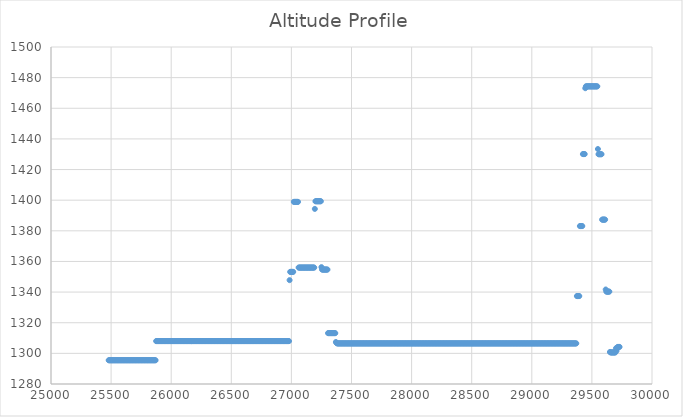
| Category | Series 0 |
|---|---|
| 25480.0 | 1295.5 |
| 25485.0 | 1295.5 |
| 25490.0 | 1295.5 |
| 25495.0 | 1295.5 |
| 25500.0 | 1295.5 |
| 25505.0 | 1295.5 |
| 25510.0 | 1295.5 |
| 25515.0 | 1295.5 |
| 25520.0 | 1295.5 |
| 25525.0 | 1295.5 |
| 25530.0 | 1295.5 |
| 25535.0 | 1295.5 |
| 25540.0 | 1295.5 |
| 25545.0 | 1295.5 |
| 25550.0 | 1295.5 |
| 25555.0 | 1295.5 |
| 25560.0 | 1295.5 |
| 25565.0 | 1295.5 |
| 25570.0 | 1295.5 |
| 25575.0 | 1295.5 |
| 25580.0 | 1295.5 |
| 25585.0 | 1295.5 |
| 25590.0 | 1295.5 |
| 25595.0 | 1295.5 |
| 25600.0 | 1295.5 |
| 25605.0 | 1295.5 |
| 25610.0 | 1295.5 |
| 25615.0 | 1295.5 |
| 25620.0 | 1295.5 |
| 25625.0 | 1295.5 |
| 25630.0 | 1295.5 |
| 25635.0 | 1295.5 |
| 25640.0 | 1295.5 |
| 25645.0 | 1295.5 |
| 25650.0 | 1295.5 |
| 25655.0 | 1295.5 |
| 25660.0 | 1295.5 |
| 25665.0 | 1295.5 |
| 25670.0 | 1295.5 |
| 25675.0 | 1295.5 |
| 25680.0 | 1295.5 |
| 25685.0 | 1295.5 |
| 25690.0 | 1295.5 |
| 25695.0 | 1295.5 |
| 25700.0 | 1295.5 |
| 25705.0 | 1295.5 |
| 25710.0 | 1295.5 |
| 25715.0 | 1295.5 |
| 25720.0 | 1295.5 |
| 25725.0 | 1295.5 |
| 25730.0 | 1295.5 |
| 25735.0 | 1295.5 |
| 25740.0 | 1295.5 |
| 25745.0 | 1295.5 |
| 25750.0 | 1295.5 |
| 25755.0 | 1295.5 |
| 25760.0 | 1295.5 |
| 25765.0 | 1295.5 |
| 25770.0 | 1295.5 |
| 25775.0 | 1295.5 |
| 25780.0 | 1295.5 |
| 25785.0 | 1295.5 |
| 25790.0 | 1295.5 |
| 25795.0 | 1295.5 |
| 25800.0 | 1295.5 |
| 25805.0 | 1295.5 |
| 25810.0 | 1295.5 |
| 25815.0 | 1295.5 |
| 25820.0 | 1295.5 |
| 25825.0 | 1295.5 |
| 25830.0 | 1295.5 |
| 25835.0 | 1295.5 |
| 25840.0 | 1295.5 |
| 25845.0 | 1295.5 |
| 25850.0 | 1295.5 |
| 25855.0 | 1295.5 |
| 25860.0 | 1295.5 |
| 25865.0 | 1295.5 |
| 25870.0 | 1295.5 |
| 25875.0 | 1308 |
| 25880.0 | 1308 |
| 25885.0 | 1308 |
| 25890.0 | 1308 |
| 25895.0 | 1308 |
| 25900.0 | 1308 |
| 25905.0 | 1308 |
| 25910.0 | 1308 |
| 25915.0 | 1308 |
| 25920.0 | 1308 |
| 25925.0 | 1308 |
| 25930.0 | 1308 |
| 25935.0 | 1308 |
| 25940.0 | 1308 |
| 25945.0 | 1308 |
| 25950.0 | 1308 |
| 25955.0 | 1308 |
| 25960.0 | 1308 |
| 25965.0 | 1308 |
| 25970.0 | 1308 |
| 25975.0 | 1308 |
| 25980.0 | 1308 |
| 25985.0 | 1308 |
| 25990.0 | 1308 |
| 25995.0 | 1308 |
| 26000.0 | 1308 |
| 26005.0 | 1308 |
| 26010.0 | 1308 |
| 26015.0 | 1308 |
| 26020.0 | 1308 |
| 26025.0 | 1308 |
| 26030.0 | 1308 |
| 26035.0 | 1308 |
| 26040.0 | 1308 |
| 26045.0 | 1308 |
| 26050.0 | 1308 |
| 26055.0 | 1308 |
| 26060.0 | 1308 |
| 26065.0 | 1308 |
| 26070.0 | 1308 |
| 26075.0 | 1308 |
| 26080.0 | 1308 |
| 26085.0 | 1308 |
| 26090.0 | 1308 |
| 26095.0 | 1308 |
| 26100.0 | 1308 |
| 26105.0 | 1308 |
| 26110.0 | 1308 |
| 26115.0 | 1308 |
| 26120.0 | 1308 |
| 26125.0 | 1308 |
| 26130.0 | 1308 |
| 26135.0 | 1308 |
| 26140.0 | 1308 |
| 26145.0 | 1308 |
| 26150.0 | 1308 |
| 26155.0 | 1308 |
| 26160.0 | 1308 |
| 26165.0 | 1308 |
| 26170.0 | 1308 |
| 26170.0 | 1308 |
| 26175.0 | 1308 |
| 26180.0 | 1308 |
| 26185.0 | 1308 |
| 26190.0 | 1308 |
| 26195.0 | 1308 |
| 26200.0 | 1308 |
| 26205.0 | 1308 |
| 26210.0 | 1308 |
| 26215.0 | 1308 |
| 26220.0 | 1308 |
| 26225.0 | 1308 |
| 26230.0 | 1308 |
| 26235.0 | 1308 |
| 26240.0 | 1308 |
| 26245.0 | 1308 |
| 26250.0 | 1308 |
| 26255.0 | 1308 |
| 26260.0 | 1308 |
| 26265.0 | 1308 |
| 26270.0 | 1308 |
| 26275.0 | 1308 |
| 26280.0 | 1308 |
| 26285.0 | 1308 |
| 26290.0 | 1308 |
| 26295.0 | 1308 |
| 26300.0 | 1308 |
| 26305.0 | 1308 |
| 26310.0 | 1308 |
| 26315.0 | 1308 |
| 26320.0 | 1308 |
| 26325.0 | 1308 |
| 26330.0 | 1308 |
| 26335.0 | 1308 |
| 26340.0 | 1308 |
| 26345.0 | 1308 |
| 26350.0 | 1308 |
| 26355.0 | 1308 |
| 26360.0 | 1308 |
| 26365.0 | 1308 |
| 26370.0 | 1308 |
| 26375.0 | 1308 |
| 26380.0 | 1308 |
| 26385.0 | 1308 |
| 26390.0 | 1308 |
| 26395.0 | 1308 |
| 26400.0 | 1308 |
| 26405.0 | 1308 |
| 26410.0 | 1308 |
| 26415.0 | 1308 |
| 26420.0 | 1308 |
| 26425.0 | 1308 |
| 26430.0 | 1308 |
| 26435.0 | 1308 |
| 26440.0 | 1308 |
| 26445.0 | 1308 |
| 26450.0 | 1308 |
| 26455.0 | 1308 |
| 26460.0 | 1308 |
| 26465.0 | 1308 |
| 26470.0 | 1308 |
| 26475.0 | 1308 |
| 26480.0 | 1308 |
| 26485.0 | 1308 |
| 26490.0 | 1308 |
| 26495.0 | 1308 |
| 26500.0 | 1308 |
| 26505.0 | 1308 |
| 26510.0 | 1308 |
| 26515.0 | 1308 |
| 26520.0 | 1308 |
| 26525.0 | 1308 |
| 26530.0 | 1308 |
| 26535.0 | 1308 |
| 26540.0 | 1308 |
| 26545.0 | 1308 |
| 26550.0 | 1308 |
| 26555.0 | 1308 |
| 26560.0 | 1308 |
| 26565.0 | 1308 |
| 26570.0 | 1308 |
| 26575.0 | 1308 |
| 26580.0 | 1308 |
| 26585.0 | 1308 |
| 26590.0 | 1308 |
| 26595.0 | 1308 |
| 26600.0 | 1308 |
| 26605.0 | 1308 |
| 26610.0 | 1308 |
| 26615.0 | 1308 |
| 26620.0 | 1308 |
| 26625.0 | 1308 |
| 26630.0 | 1308 |
| 26635.0 | 1308 |
| 26640.0 | 1308 |
| 26645.0 | 1308 |
| 26650.0 | 1308 |
| 26655.0 | 1308 |
| 26660.0 | 1308 |
| 26665.0 | 1308 |
| 26670.0 | 1308 |
| 26675.0 | 1308 |
| 26680.0 | 1308 |
| 26685.0 | 1308 |
| 26690.0 | 1308 |
| 26695.0 | 1308 |
| 26700.0 | 1308 |
| 26705.0 | 1308 |
| 26710.0 | 1308 |
| 26715.0 | 1308 |
| 26720.0 | 1308 |
| 26725.0 | 1308 |
| 26730.0 | 1308 |
| 26735.0 | 1308 |
| 26740.0 | 1308 |
| 26745.0 | 1308 |
| 26750.0 | 1308 |
| 26755.0 | 1308 |
| 26760.0 | 1308 |
| 26765.0 | 1308 |
| 26770.0 | 1308 |
| 26775.0 | 1308 |
| 26780.0 | 1308 |
| 26785.0 | 1308 |
| 26790.0 | 1308 |
| 26795.0 | 1308 |
| 26800.0 | 1308 |
| 26805.0 | 1308 |
| 26810.0 | 1308 |
| 26815.0 | 1308 |
| 26820.0 | 1308 |
| 26825.0 | 1308 |
| 26830.0 | 1308 |
| 26835.0 | 1308 |
| 26840.0 | 1308 |
| 26845.0 | 1308 |
| 26850.0 | 1308 |
| 26855.0 | 1308 |
| 26860.0 | 1308 |
| 26865.0 | 1308 |
| 26870.0 | 1308 |
| 26875.0 | 1308 |
| 26880.0 | 1308 |
| 26885.0 | 1308 |
| 26890.0 | 1308 |
| 26895.0 | 1308 |
| 26900.0 | 1308 |
| 26905.0 | 1308 |
| 26910.0 | 1308 |
| 26915.0 | 1308 |
| 26920.0 | 1308 |
| 26925.0 | 1308 |
| 26930.0 | 1308 |
| 26935.0 | 1308 |
| 26940.0 | 1308 |
| 26945.0 | 1308 |
| 26950.0 | 1308 |
| 26955.0 | 1308 |
| 26960.0 | 1308 |
| 26965.0 | 1308 |
| 26970.0 | 1308 |
| 26975.0 | 1308 |
| 26980.0 | 1308 |
| 26985.0 | 1347.8 |
| 26990.0 | 1353.2 |
| 26995.0 | 1353.2 |
| 27000.0 | 1353.2 |
| 27005.0 | 1353.2 |
| 27010.0 | 1353.2 |
| 27015.0 | 1353.2 |
| 27020.0 | 1398.9 |
| 27025.0 | 1398.9 |
| 27030.0 | 1398.9 |
| 27035.0 | 1398.9 |
| 27040.0 | 1398.9 |
| 27045.0 | 1398.9 |
| 27050.0 | 1398.9 |
| 27055.0 | 1398.9 |
| 27060.0 | 1356 |
| 27065.0 | 1356 |
| 27070.0 | 1356 |
| 27075.0 | 1356 |
| 27080.0 | 1356 |
| 27085.0 | 1356 |
| 27090.0 | 1356 |
| 27095.0 | 1356 |
| 27100.0 | 1356 |
| 27105.0 | 1356 |
| 27110.0 | 1356 |
| 27115.0 | 1356 |
| 27120.0 | 1356 |
| 27125.0 | 1356 |
| 27130.0 | 1356 |
| 27135.0 | 1356 |
| 27140.0 | 1356 |
| 27145.0 | 1356 |
| 27150.0 | 1356 |
| 27155.0 | 1356 |
| 27160.0 | 1356 |
| 27165.0 | 1356 |
| 27170.0 | 1356 |
| 27175.0 | 1356 |
| 27180.0 | 1356 |
| 27185.0 | 1356 |
| 27190.0 | 1356 |
| 27195.0 | 1394.3 |
| 27200.0 | 1399.3 |
| 27205.0 | 1399.3 |
| 27210.0 | 1399.3 |
| 27215.0 | 1399.3 |
| 27220.0 | 1399.3 |
| 27225.0 | 1399.3 |
| 27230.0 | 1399.3 |
| 27235.0 | 1399.3 |
| 27240.0 | 1399.3 |
| 27245.0 | 1399.3 |
| 27250.0 | 1356.3 |
| 27255.0 | 1354.7 |
| 27260.0 | 1354.7 |
| 27265.0 | 1354.7 |
| 27270.0 | 1354.7 |
| 27275.0 | 1354.7 |
| 27280.0 | 1354.7 |
| 27285.0 | 1354.7 |
| 27290.0 | 1354.7 |
| 27295.0 | 1354.7 |
| 27300.0 | 1354.7 |
| 27305.0 | 1313.2 |
| 27310.0 | 1313.2 |
| 27315.0 | 1313.2 |
| 27320.0 | 1313.2 |
| 27325.0 | 1313.2 |
| 27330.0 | 1313.2 |
| 27335.0 | 1313.2 |
| 27340.0 | 1313.2 |
| 27345.0 | 1313.2 |
| 27350.0 | 1313.2 |
| 27355.0 | 1313.2 |
| 27360.0 | 1313.2 |
| 27365.0 | 1313.2 |
| 27370.0 | 1307.4 |
| 27375.0 | 1306.9 |
| 27380.0 | 1306.5 |
| 27385.0 | 1306.5 |
| 27390.0 | 1306.5 |
| 27395.0 | 1306.5 |
| 27400.0 | 1306.5 |
| 27405.0 | 1306.5 |
| 27410.0 | 1306.5 |
| 27415.0 | 1306.5 |
| 27420.0 | 1306.5 |
| 27425.0 | 1306.5 |
| 27430.0 | 1306.5 |
| 27435.0 | 1306.5 |
| 27440.0 | 1306.5 |
| 27445.0 | 1306.5 |
| 27450.0 | 1306.5 |
| 27455.0 | 1306.5 |
| 27460.0 | 1306.5 |
| 27465.0 | 1306.5 |
| 27470.0 | 1306.5 |
| 27475.0 | 1306.5 |
| 27480.0 | 1306.5 |
| 27485.0 | 1306.5 |
| 27490.0 | 1306.5 |
| 27495.0 | 1306.5 |
| 27500.0 | 1306.5 |
| 27505.0 | 1306.5 |
| 27510.0 | 1306.5 |
| 27515.0 | 1306.5 |
| 27520.0 | 1306.5 |
| 27525.0 | 1306.5 |
| 27530.0 | 1306.5 |
| 27535.0 | 1306.5 |
| 27540.0 | 1306.5 |
| 27545.0 | 1306.5 |
| 27550.0 | 1306.5 |
| 27555.0 | 1306.5 |
| 27560.0 | 1306.5 |
| 27565.0 | 1306.5 |
| 27570.0 | 1306.5 |
| 27575.0 | 1306.5 |
| 27580.0 | 1306.5 |
| 27585.0 | 1306.5 |
| 27590.0 | 1306.5 |
| 27595.0 | 1306.5 |
| 27600.0 | 1306.5 |
| 27605.0 | 1306.5 |
| 27610.0 | 1306.5 |
| 27615.0 | 1306.5 |
| 27620.0 | 1306.5 |
| 27625.0 | 1306.5 |
| 27630.0 | 1306.5 |
| 27635.0 | 1306.5 |
| 27640.0 | 1306.5 |
| 27645.0 | 1306.5 |
| 27650.0 | 1306.5 |
| 27655.0 | 1306.5 |
| 27660.0 | 1306.5 |
| 27665.0 | 1306.5 |
| 27670.0 | 1306.5 |
| 27675.0 | 1306.5 |
| 27680.0 | 1306.5 |
| 27685.0 | 1306.5 |
| 27690.0 | 1306.5 |
| 27695.0 | 1306.5 |
| 27700.0 | 1306.5 |
| 27705.0 | 1306.5 |
| 27710.0 | 1306.5 |
| 27715.0 | 1306.5 |
| 27720.0 | 1306.5 |
| 27725.0 | 1306.5 |
| 27730.0 | 1306.5 |
| 27735.0 | 1306.5 |
| 27740.0 | 1306.5 |
| 27745.0 | 1306.5 |
| 27750.0 | 1306.5 |
| 27755.0 | 1306.5 |
| 27760.0 | 1306.5 |
| 27765.0 | 1306.5 |
| 27770.0 | 1306.5 |
| 27775.0 | 1306.5 |
| 27780.0 | 1306.5 |
| 27785.0 | 1306.5 |
| 27790.0 | 1306.5 |
| 27795.0 | 1306.5 |
| 27800.0 | 1306.5 |
| 27805.0 | 1306.5 |
| 27810.0 | 1306.5 |
| 27815.0 | 1306.5 |
| 27820.0 | 1306.5 |
| 27825.0 | 1306.5 |
| 27830.0 | 1306.5 |
| 27835.0 | 1306.5 |
| 27840.0 | 1306.5 |
| 27845.0 | 1306.5 |
| 27850.0 | 1306.5 |
| 27855.0 | 1306.5 |
| 27860.0 | 1306.5 |
| 27865.0 | 1306.5 |
| 27870.0 | 1306.5 |
| 27875.0 | 1306.5 |
| 27880.0 | 1306.5 |
| 27885.0 | 1306.5 |
| 27890.0 | 1306.5 |
| 27895.0 | 1306.5 |
| 27900.0 | 1306.5 |
| 27905.0 | 1306.5 |
| 27910.0 | 1306.5 |
| 27915.0 | 1306.5 |
| 27920.0 | 1306.5 |
| 27925.0 | 1306.5 |
| 27930.0 | 1306.5 |
| 27935.0 | 1306.5 |
| 27940.0 | 1306.5 |
| 27945.0 | 1306.5 |
| 27950.0 | 1306.5 |
| 27955.0 | 1306.5 |
| 27960.0 | 1306.5 |
| 27965.0 | 1306.5 |
| 27970.0 | 1306.5 |
| 27975.0 | 1306.5 |
| 27980.0 | 1306.5 |
| 27985.0 | 1306.5 |
| 27990.0 | 1306.5 |
| 27995.0 | 1306.5 |
| 28000.0 | 1306.5 |
| 28005.0 | 1306.5 |
| 28010.0 | 1306.5 |
| 28015.0 | 1306.5 |
| 28020.0 | 1306.5 |
| 28025.0 | 1306.5 |
| 28030.0 | 1306.5 |
| 28035.0 | 1306.5 |
| 28040.0 | 1306.5 |
| 28045.0 | 1306.5 |
| 28050.0 | 1306.5 |
| 28055.0 | 1306.5 |
| 28060.0 | 1306.5 |
| 28065.0 | 1306.5 |
| 28070.0 | 1306.5 |
| 28075.0 | 1306.5 |
| 28080.0 | 1306.5 |
| 28085.0 | 1306.5 |
| 28090.0 | 1306.5 |
| 28095.0 | 1306.5 |
| 28100.0 | 1306.5 |
| 28105.0 | 1306.5 |
| 28110.0 | 1306.5 |
| 28115.0 | 1306.5 |
| 28120.0 | 1306.5 |
| 28125.0 | 1306.5 |
| 28130.0 | 1306.5 |
| 28135.0 | 1306.5 |
| 28140.0 | 1306.5 |
| 28145.0 | 1306.5 |
| 28150.0 | 1306.5 |
| 28155.0 | 1306.5 |
| 28160.0 | 1306.5 |
| 28165.0 | 1306.5 |
| 28170.0 | 1306.5 |
| 28175.0 | 1306.5 |
| 28180.0 | 1306.5 |
| 28185.0 | 1306.5 |
| 28190.0 | 1306.5 |
| 28195.0 | 1306.5 |
| 28200.0 | 1306.5 |
| 28205.0 | 1306.5 |
| 28210.0 | 1306.5 |
| 28215.0 | 1306.5 |
| 28220.0 | 1306.5 |
| 28225.0 | 1306.5 |
| 28230.0 | 1306.5 |
| 28235.0 | 1306.5 |
| 28240.0 | 1306.5 |
| 28245.0 | 1306.5 |
| 28250.0 | 1306.5 |
| 28255.0 | 1306.5 |
| 28260.0 | 1306.5 |
| 28265.0 | 1306.5 |
| 28270.0 | 1306.5 |
| 28275.0 | 1306.5 |
| 28280.0 | 1306.5 |
| 28285.0 | 1306.5 |
| 28290.0 | 1306.5 |
| 28295.0 | 1306.5 |
| 28300.0 | 1306.5 |
| 28305.0 | 1306.5 |
| 28310.0 | 1306.5 |
| 28315.0 | 1306.5 |
| 28320.0 | 1306.5 |
| 28325.0 | 1306.5 |
| 28330.0 | 1306.5 |
| 28335.0 | 1306.5 |
| 28340.0 | 1306.5 |
| 28345.0 | 1306.5 |
| 28350.0 | 1306.5 |
| 28355.0 | 1306.5 |
| 28360.0 | 1306.5 |
| 28365.0 | 1306.5 |
| 28370.0 | 1306.5 |
| 28375.0 | 1306.5 |
| 28380.0 | 1306.5 |
| 28385.0 | 1306.5 |
| 28390.0 | 1306.5 |
| 28395.0 | 1306.5 |
| 28400.0 | 1306.5 |
| 28405.0 | 1306.5 |
| 28410.0 | 1306.5 |
| 28415.0 | 1306.5 |
| 28420.0 | 1306.5 |
| 28425.0 | 1306.5 |
| 28430.0 | 1306.5 |
| 28435.0 | 1306.5 |
| 28440.0 | 1306.5 |
| 28445.0 | 1306.5 |
| 28450.0 | 1306.5 |
| 28455.0 | 1306.5 |
| 28460.0 | 1306.5 |
| 28465.0 | 1306.5 |
| 28470.0 | 1306.5 |
| 28475.0 | 1306.5 |
| 28480.0 | 1306.5 |
| 28485.0 | 1306.5 |
| 28490.0 | 1306.5 |
| 28495.0 | 1306.5 |
| 28500.0 | 1306.5 |
| 28505.0 | 1306.5 |
| 28510.0 | 1306.5 |
| 28515.0 | 1306.5 |
| 28520.0 | 1306.5 |
| 28525.0 | 1306.5 |
| 28530.0 | 1306.5 |
| 28535.0 | 1306.5 |
| 28540.0 | 1306.5 |
| 28545.0 | 1306.5 |
| 28550.0 | 1306.5 |
| 28555.0 | 1306.5 |
| 28560.0 | 1306.5 |
| 28565.0 | 1306.5 |
| 28570.0 | 1306.5 |
| 28575.0 | 1306.5 |
| 28580.0 | 1306.5 |
| 28585.0 | 1306.5 |
| 28590.0 | 1306.5 |
| 28595.0 | 1306.5 |
| 28600.0 | 1306.5 |
| 28605.0 | 1306.5 |
| 28610.0 | 1306.5 |
| 28615.0 | 1306.5 |
| 28620.0 | 1306.5 |
| 28625.0 | 1306.5 |
| 28630.0 | 1306.5 |
| 28635.0 | 1306.5 |
| 28640.0 | 1306.5 |
| 28645.0 | 1306.5 |
| 28650.0 | 1306.5 |
| 28655.0 | 1306.5 |
| 28660.0 | 1306.5 |
| 28665.0 | 1306.5 |
| 28670.0 | 1306.5 |
| 28675.0 | 1306.5 |
| 28680.0 | 1306.5 |
| 28685.0 | 1306.5 |
| 28690.0 | 1306.5 |
| 28695.0 | 1306.5 |
| 28700.0 | 1306.5 |
| 28705.0 | 1306.5 |
| 28710.0 | 1306.5 |
| 28715.0 | 1306.5 |
| 28720.0 | 1306.5 |
| 28725.0 | 1306.5 |
| 28730.0 | 1306.5 |
| 28735.0 | 1306.5 |
| 28740.0 | 1306.5 |
| 28745.0 | 1306.5 |
| 28750.0 | 1306.5 |
| 28755.0 | 1306.5 |
| 28760.0 | 1306.5 |
| 28765.0 | 1306.5 |
| 28770.0 | 1306.5 |
| 28775.0 | 1306.5 |
| 28780.0 | 1306.5 |
| 28785.0 | 1306.5 |
| 28790.0 | 1306.5 |
| 28795.0 | 1306.5 |
| 28800.0 | 1306.5 |
| 28805.0 | 1306.5 |
| 28810.0 | 1306.5 |
| 28815.0 | 1306.5 |
| 28820.0 | 1306.5 |
| 28825.0 | 1306.5 |
| 28830.0 | 1306.5 |
| 28835.0 | 1306.5 |
| 28840.0 | 1306.5 |
| 28845.0 | 1306.5 |
| 28850.0 | 1306.5 |
| 28855.0 | 1306.5 |
| 28860.0 | 1306.5 |
| 28865.0 | 1306.5 |
| 28870.0 | 1306.5 |
| 28875.0 | 1306.5 |
| 28880.0 | 1306.5 |
| 28885.0 | 1306.5 |
| 28890.0 | 1306.5 |
| 28895.0 | 1306.5 |
| 28900.0 | 1306.5 |
| 28905.0 | 1306.5 |
| 28910.0 | 1306.5 |
| 28915.0 | 1306.5 |
| 28920.0 | 1306.5 |
| 28925.0 | 1306.5 |
| 28930.0 | 1306.5 |
| 28935.0 | 1306.5 |
| 28940.0 | 1306.5 |
| 28945.0 | 1306.5 |
| 28950.0 | 1306.5 |
| 28955.0 | 1306.5 |
| 28960.0 | 1306.5 |
| 28965.0 | 1306.5 |
| 28970.0 | 1306.5 |
| 28975.0 | 1306.5 |
| 28980.0 | 1306.5 |
| 28985.0 | 1306.5 |
| 28990.0 | 1306.5 |
| 28995.0 | 1306.5 |
| 29000.0 | 1306.5 |
| 29005.0 | 1306.5 |
| 29010.0 | 1306.5 |
| 29015.0 | 1306.5 |
| 29020.0 | 1306.5 |
| 29025.0 | 1306.5 |
| 29030.0 | 1306.5 |
| 29035.0 | 1306.5 |
| 29040.0 | 1306.5 |
| 29045.0 | 1306.5 |
| 29050.0 | 1306.5 |
| 29055.0 | 1306.5 |
| 29060.0 | 1306.5 |
| 29065.0 | 1306.5 |
| 29070.0 | 1306.5 |
| 29075.0 | 1306.5 |
| 29080.0 | 1306.5 |
| 29085.0 | 1306.5 |
| 29090.0 | 1306.5 |
| 29095.0 | 1306.5 |
| 29100.0 | 1306.5 |
| 29105.0 | 1306.5 |
| 29110.0 | 1306.5 |
| 29115.0 | 1306.5 |
| 29120.0 | 1306.5 |
| 29125.0 | 1306.5 |
| 29130.0 | 1306.5 |
| 29135.0 | 1306.5 |
| 29140.0 | 1306.5 |
| 29145.0 | 1306.5 |
| 29150.0 | 1306.5 |
| 29155.0 | 1306.5 |
| 29160.0 | 1306.5 |
| 29165.0 | 1306.5 |
| 29170.0 | 1306.5 |
| 29175.0 | 1306.5 |
| 29180.0 | 1306.5 |
| 29185.0 | 1306.5 |
| 29190.0 | 1306.5 |
| 29195.0 | 1306.5 |
| 29200.0 | 1306.5 |
| 29205.0 | 1306.5 |
| 29210.0 | 1306.5 |
| 29215.0 | 1306.5 |
| 29220.0 | 1306.5 |
| 29225.0 | 1306.5 |
| 29230.0 | 1306.5 |
| 29235.0 | 1306.5 |
| 29240.0 | 1306.5 |
| 29245.0 | 1306.5 |
| 29250.0 | 1306.5 |
| 29255.0 | 1306.5 |
| 29260.0 | 1306.5 |
| 29265.0 | 1306.5 |
| 29270.0 | 1306.5 |
| 29275.0 | 1306.5 |
| 29280.0 | 1306.5 |
| 29285.0 | 1306.5 |
| 29290.0 | 1306.5 |
| 29295.0 | 1306.5 |
| 29300.0 | 1306.5 |
| 29305.0 | 1306.5 |
| 29310.0 | 1306.5 |
| 29315.0 | 1306.5 |
| 29320.0 | 1306.5 |
| 29325.0 | 1306.5 |
| 29330.0 | 1306.5 |
| 29335.0 | 1306.5 |
| 29340.0 | 1306.5 |
| 29345.0 | 1306.5 |
| 29350.0 | 1306.5 |
| 29355.0 | 1306.5 |
| 29360.0 | 1306.5 |
| 29365.0 | 1306.5 |
| 29370.0 | 1306.5 |
| 29375.0 | 1337.4 |
| 29380.0 | 1337.4 |
| 29385.0 | 1337.4 |
| 29390.0 | 1337.4 |
| 29395.0 | 1337.4 |
| 29400.0 | 1383.1 |
| 29405.0 | 1383.1 |
| 29410.0 | 1383.1 |
| 29415.0 | 1383.1 |
| 29420.0 | 1383.1 |
| 29425.0 | 1430.1 |
| 29430.0 | 1430.1 |
| 29435.0 | 1430.1 |
| 29440.0 | 1430.1 |
| 29445.0 | 1473.1 |
| 29450.0 | 1474.3 |
| 29455.0 | 1474.3 |
| 29460.0 | 1474.3 |
| 29465.0 | 1474.3 |
| 29470.0 | 1474.3 |
| 29475.0 | 1474.3 |
| 29480.0 | 1474.3 |
| 29485.0 | 1474.3 |
| 29490.0 | 1474.3 |
| 29495.0 | 1474.3 |
| 29500.0 | 1474.3 |
| 29505.0 | 1474.3 |
| 29510.0 | 1474.3 |
| 29515.0 | 1474.3 |
| 29520.0 | 1474.3 |
| 29525.0 | 1474.3 |
| 29530.0 | 1474.3 |
| 29535.0 | 1474.3 |
| 29540.0 | 1474.3 |
| 29545.0 | 1474.3 |
| 29550.0 | 1433.4 |
| 29555.0 | 1430 |
| 29560.0 | 1430 |
| 29565.0 | 1430 |
| 29570.0 | 1430 |
| 29575.0 | 1430 |
| 29580.0 | 1430 |
| 29585.0 | 1387.3 |
| 29590.0 | 1387.3 |
| 29595.0 | 1387.3 |
| 29600.0 | 1387.3 |
| 29605.0 | 1387.3 |
| 29610.0 | 1387.3 |
| 29615.0 | 1341.7 |
| 29620.0 | 1340.3 |
| 29625.0 | 1340.3 |
| 29630.0 | 1340.3 |
| 29635.0 | 1340.3 |
| 29640.0 | 1340.3 |
| 29645.0 | 1340.3 |
| 29650.0 | 1300.9 |
| 29655.0 | 1300.6 |
| 29660.0 | 1300.6 |
| 29665.0 | 1300.6 |
| 29670.0 | 1300.6 |
| 29675.0 | 1300.6 |
| 29680.0 | 1300.6 |
| 29685.0 | 1300.6 |
| 29690.0 | 1300.6 |
| 29695.0 | 1300.6 |
| 29700.0 | 1303.3 |
| 29705.0 | 1301.7 |
| 29710.0 | 1303.7 |
| 29715.0 | 1304.2 |
| 29720.0 | 1304.2 |
| 29725.0 | 1304.2 |
| 29730.0 | 1304.2 |